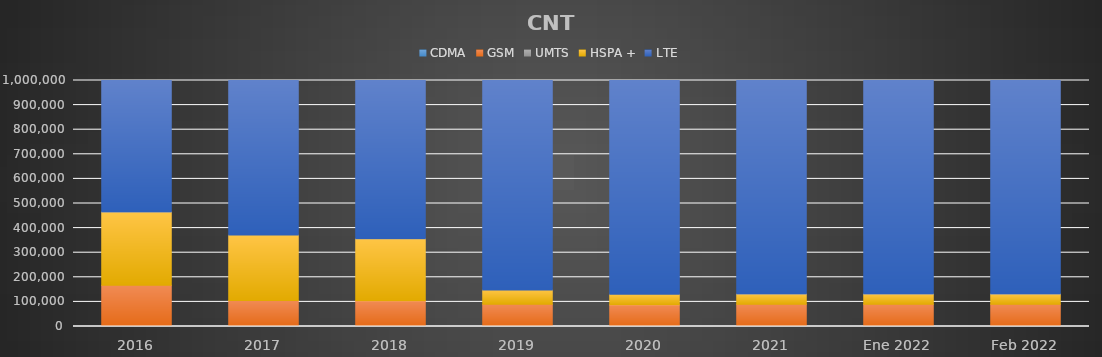
| Category | CDMA | GSM | UMTS | HSPA + | LTE |
|---|---|---|---|---|---|
| 2016 | 0 | 167794 | 0 | 297924 | 1075501 |
| 2017 | 0 | 105840 | 0 | 265966 | 1770311 |
| 2018 | 0 | 104907 | 0 | 252233 | 2488002 |
| 2019 | 0 | 90785 | 0 | 57576 | 2755329 |
| 2020 | 0 | 88328 | 0 | 42633 | 2695427 |
| 2021 | 0 | 90490 | 0 | 41720 | 2737207 |
| Ene 2022 | 0 | 90494 | 0 | 41783 | 2747791 |
| Feb 2022 | 0 | 90620 | 0 | 41640 | 2753688 |